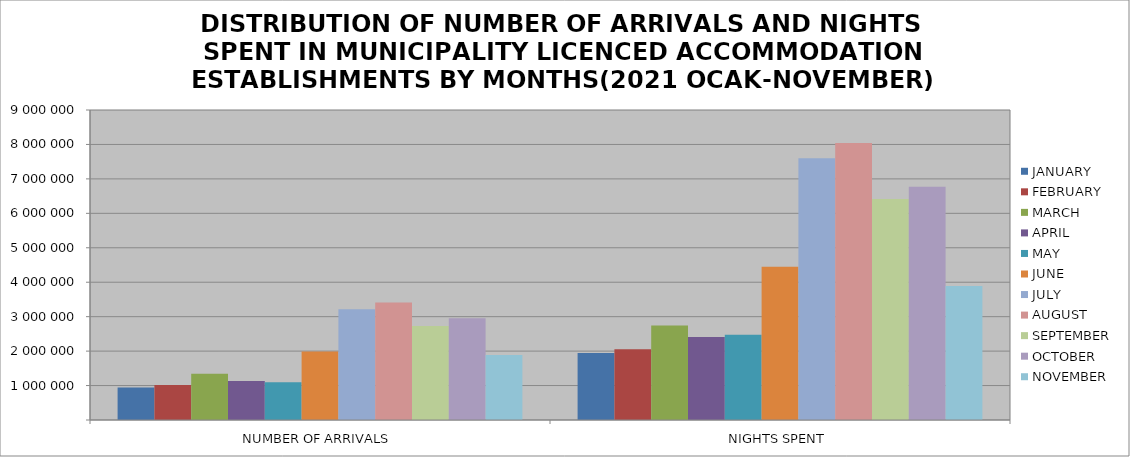
| Category | JANUARY | FEBRUARY | MARCH | APRIL | MAY | JUNE | JULY | AUGUST | SEPTEMBER | OCTOBER | NOVEMBER |
|---|---|---|---|---|---|---|---|---|---|---|---|
| NUMBER OF ARRIVALS | 940331 | 1017199 | 1342202 | 1131069 | 1098456 | 1989433 | 3215014 | 3414690 | 2728285 | 2955029 | 1885159 |
| NIGHTS SPENT | 1943007 | 2056594 | 2743257 | 2406723 | 2471826 | 4450821 | 7597288 | 8039529 | 6417353 | 6772005 | 3888626 |